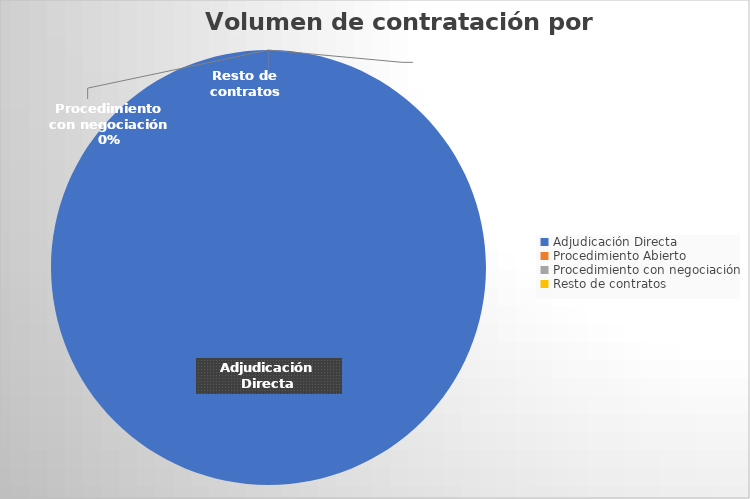
| Category | Series 0 |
|---|---|
| Adjudicación Directa | 2541 |
| Procedimiento Abierto | 0 |
| Procedimiento con negociación | 0 |
| Resto de contratos | 0 |